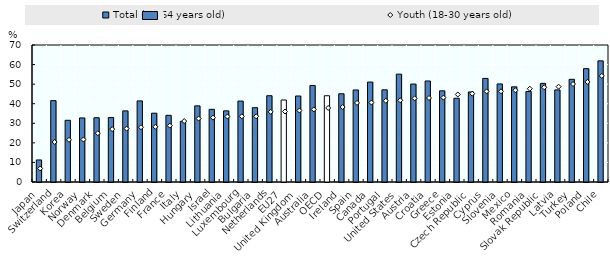
| Category | Total (18-64 years old) |
|---|---|
| Japan | 11.273 |
| Switzerland | 41.57 |
| Korea | 31.529 |
| Norway | 32.731 |
| Denmark | 32.839 |
| Belgium | 32.943 |
| Sweden | 36.338 |
| Germany | 41.437 |
| Finland | 35.158 |
| France | 34.064 |
| Italy | 30.988 |
| Hungary | 38.902 |
| Israel | 37.129 |
| Lithuania | 36.351 |
| Luxembourg | 41.353 |
| Bulgaria | 37.973 |
| Netherlands | 44.088 |
| EU27 | 41.9 |
| United Kingdom | 43.949 |
| Australia | 49.303 |
| OECD | 44.071 |
| Ireland | 45.086 |
| Spain | 47.023 |
| Canada | 51.07 |
| Portugal | 47.097 |
| United States | 55.097 |
| Austria | 50.044 |
| Croatia | 51.609 |
| Greece | 46.578 |
| Estonia | 42.8 |
| Czech Republic | 46.014 |
| Cyprus | 52.932 |
| Slovenia | 50.11 |
| Mexico | 48.626 |
| Romania | 46.227 |
| Slovak Republic | 50.4 |
| Latvia | 47.06 |
| Turkey | 52.46 |
| Poland | 57.91 |
| Chile | 61.904 |